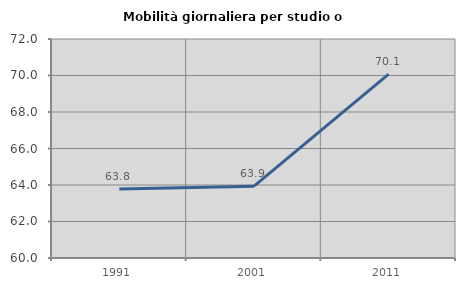
| Category | Mobilità giornaliera per studio o lavoro |
|---|---|
| 1991.0 | 63.785 |
| 2001.0 | 63.938 |
| 2011.0 | 70.081 |